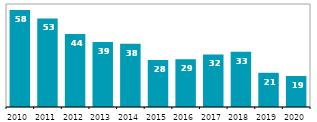
| Category | CZK billion |
|---|---|
| 2010 | 58.449 |
| 2011 | 53.295 |
| 2012 | 43.995 |
| 2013 | 39.075 |
| 2014 | 38.036 |
| 2015 | 28.274 |
| 2016 | 28.813 |
| 2017 | 31.619 |
| 2018 | 33.276 |
| 2019 | 20.595 |
| 2020 | 18.66 |